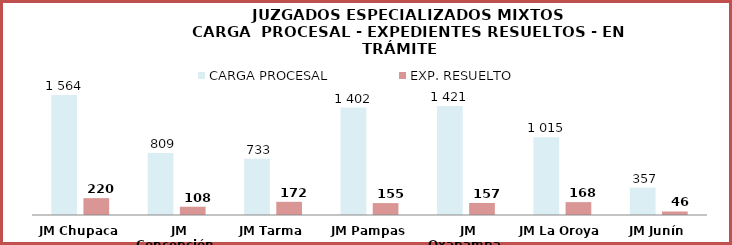
| Category | CARGA PROCESAL | EXP. RESUELTO |
|---|---|---|
| JM Chupaca | 1564 | 220 |
| JM Concepción | 809 | 108 |
| JM Tarma | 733 | 172 |
| JM Pampas | 1402 | 155 |
| JM Oxapampa | 1421 | 157 |
| JM La Oroya | 1015 | 168 |
| JM Junín | 357 | 46 |